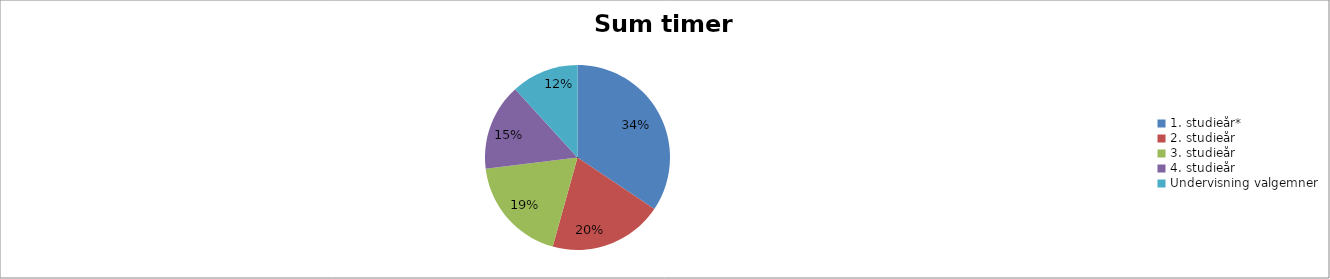
| Category | Sum timer 2017 |
|---|---|
| 1. studieår* | 4170.615 |
| 2. studieår | 2412.967 |
| 3. studieår | 2270.769 |
| 4. studieår | 1840.308 |
| Undervisning valgemner | 1426 |